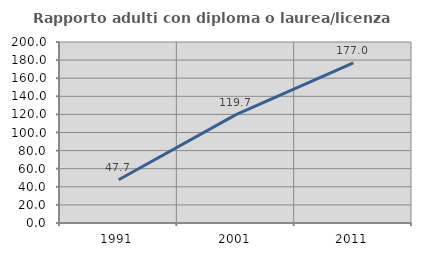
| Category | Rapporto adulti con diploma o laurea/licenza media  |
|---|---|
| 1991.0 | 47.735 |
| 2001.0 | 119.697 |
| 2011.0 | 177.039 |